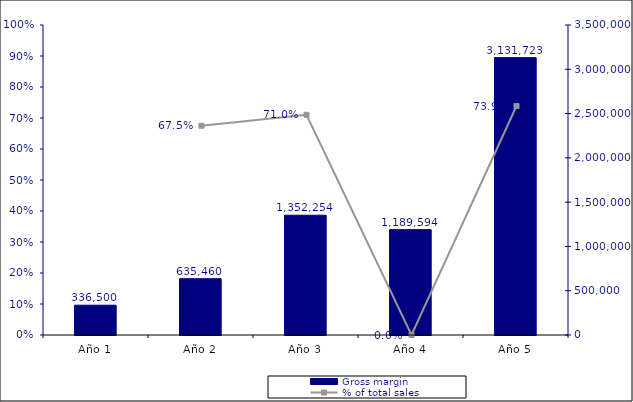
| Category | Gross margin |
|---|---|
| Año 1 | 336500 |
| Año 2 | 635460 |
| Año 3 | 1352253.525 |
| Año 4 | 1189594.38 |
| Año 5 | 3131722.614 |